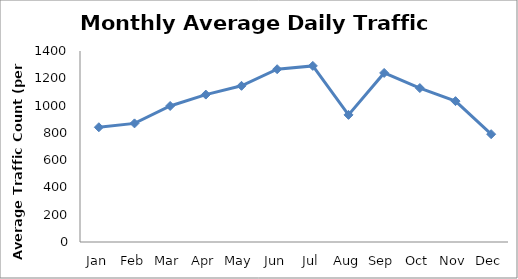
| Category | Series 0 |
|---|---|
| Jan | 841 |
| Feb | 869.5 |
| Mar | 997 |
| Apr | 1080.5 |
| May | 1144.75 |
| Jun | 1266.5 |
| Jul | 1290.75 |
| Aug | 931.75 |
| Sep | 1239.25 |
| Oct | 1128.25 |
| Nov | 1032.5 |
| Dec | 790.25 |